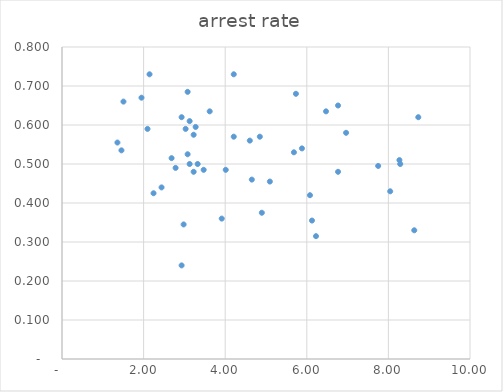
| Category | arrest rate |
|---|---|
| 1.3587875 | 0.555 |
| 1.4571 | 0.535 |
| 1.5062562499999999 | 0.66 |
| 2.09613125 | 0.59 |
| 1.9486624999999997 | 0.67 |
| 2.1452875 | 0.73 |
| 2.2436 | 0.425 |
| 2.9317875 | 0.24 |
| 2.98094375 | 0.345 |
| 2.440225 | 0.44 |
| 2.7843187499999997 | 0.49 |
| 2.6860062499999997 | 0.515 |
| 3.0300999999999996 | 0.59 |
| 2.9317875 | 0.62 |
| 3.2267249999999996 | 0.48 |
| 3.47250625 | 0.485 |
| 3.1284124999999996 | 0.5 |
| 3.3250374999999996 | 0.5 |
| 3.07925625 | 0.525 |
| 3.2267249999999996 | 0.575 |
| 3.27588125 | 0.595 |
| 3.1284124999999996 | 0.61 |
| 3.6199749999999997 | 0.635 |
| 3.07925625 | 0.685 |
| 3.9149125 | 0.36 |
| 4.013225 | 0.485 |
| 4.6031 | 0.56 |
| 4.20985 | 0.57 |
| 4.20985 | 0.73 |
| 4.8980375 | 0.375 |
| 4.65225625 | 0.46 |
| 5.0946625 | 0.455 |
| 4.84888125 | 0.57 |
| 6.126943750000001 | 0.355 |
| 5.6845375 | 0.53 |
| 5.8811625 | 0.54 |
| 6.22525625 | 0.315 |
| 6.765975 | 0.48 |
| 6.9626 | 0.58 |
| 6.4710375 | 0.635 |
| 6.765975 | 0.65 |
| 7.7491 | 0.495 |
| 8.0440375 | 0.43 |
| 8.28981875 | 0.5 |
| 8.27015625 | 0.51 |
| 8.6339125 | 0.33 |
| 8.732225 | 0.62 |
| 6.0777875 | 0.42 |
| 5.7336937500000005 | 0.68 |